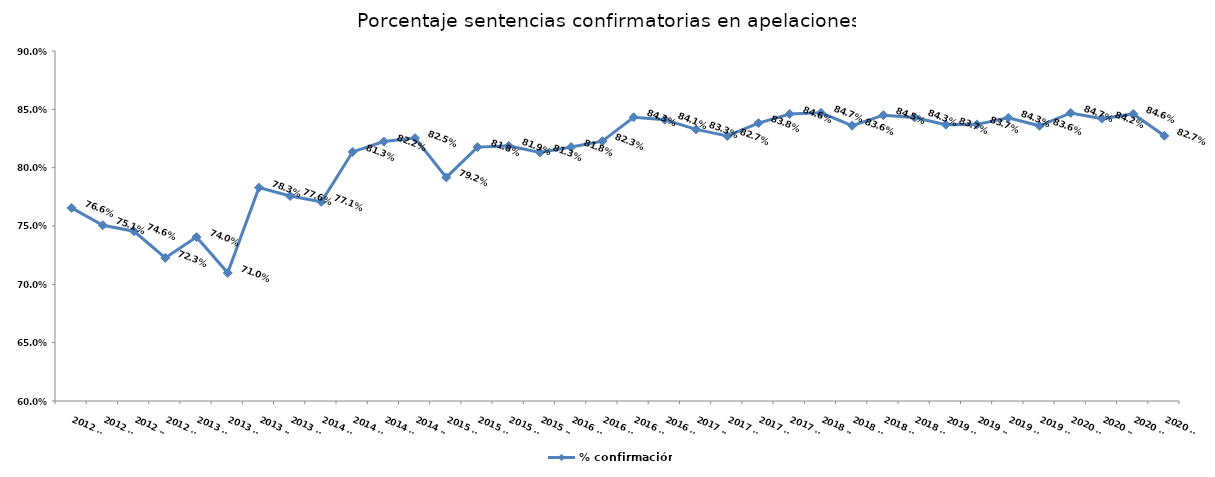
| Category | % confirmación |
|---|---|
| 2012 T1 | 0.766 |
| 2012 T2 | 0.751 |
| 2012 T3 | 0.746 |
| 2012 T4 | 0.723 |
| 2013 T1 | 0.74 |
| 2013 T2 | 0.71 |
| 2013 T3 | 0.783 |
| 2013 T4 | 0.776 |
| 2014 T1 | 0.771 |
| 2014 T2 | 0.813 |
| 2014 T3 | 0.822 |
| 2014 T4 | 0.825 |
| 2015 T1 | 0.792 |
| 2015 T2 | 0.818 |
| 2015 T3 | 0.819 |
| 2015 T4 | 0.813 |
| 2016 T1 | 0.818 |
| 2016 T2 | 0.823 |
| 2016 T3 | 0.843 |
| 2016 T4 | 0.841 |
| 2017 T1 | 0.833 |
| 2017 T2 | 0.827 |
| 2017 T3 | 0.838 |
| 2017 T4 | 0.846 |
| 2018 T1 | 0.847 |
| 2018 T2 | 0.836 |
| 2018 T3 | 0.845 |
| 2018 T4 | 0.843 |
| 2019 T1 | 0.837 |
| 2019 T2 | 0.837 |
| 2019 T3 | 0.843 |
| 2019 T4 | 0.836 |
| 2020 T1 | 0.847 |
| 2020 T2 | 0.842 |
| 2020 T3 | 0.846 |
| 2020 T4 | 0.827 |